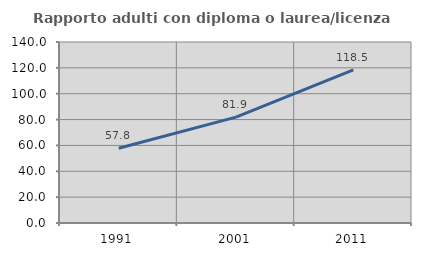
| Category | Rapporto adulti con diploma o laurea/licenza media  |
|---|---|
| 1991.0 | 57.798 |
| 2001.0 | 81.92 |
| 2011.0 | 118.514 |